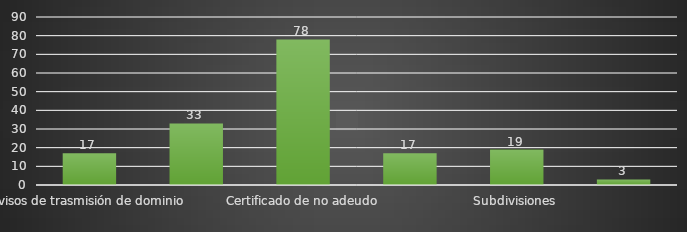
| Category | INDICADOR  |
|---|---|
| Avisos de trasmisión de dominio | 17 |
| Autorización de avalúos | 33 |
| Certificado de no adeudo | 78 |
| Historial catastral | 17 |
| Subdivisiones | 19 |
| Dictamen de valor para trasmisión de Titulo Corett | 3 |